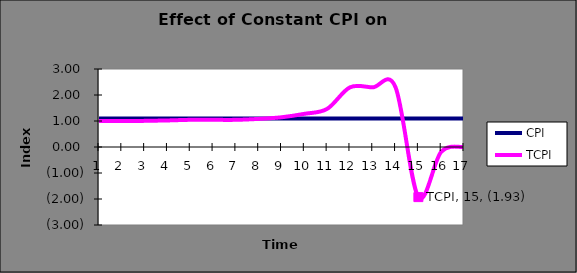
| Category | CPI | TCPI |
|---|---|---|
| 0 | 1.1 | 1.002 |
| 1 | 1.1 | 1.003 |
| 2 | 1.1 | 1.005 |
| 3 | 1.1 | 1.021 |
| 4 | 1.1 | 1.045 |
| 5 | 1.1 | 1.045 |
| 6 | 1.1 | 1.045 |
| 7 | 1.1 | 1.081 |
| 8 | 1.1 | 1.143 |
| 9 | 1.1 | 1.275 |
| 10 | 1.1 | 1.466 |
| 11 | 1.1 | 2.294 |
| 12 | 1.1 | 2.294 |
| 13 | 1.1 | 2.294 |
| 14 | 1.1 | -1.928 |
| 15 | 1.1 | -0.186 |
| 16 | 1.1 | 0 |